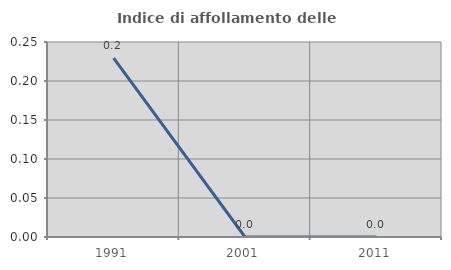
| Category | Indice di affollamento delle abitazioni  |
|---|---|
| 1991.0 | 0.229 |
| 2001.0 | 0 |
| 2011.0 | 0 |